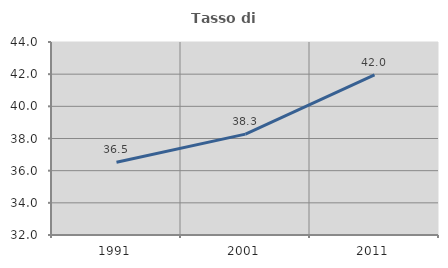
| Category | Tasso di occupazione   |
|---|---|
| 1991.0 | 36.525 |
| 2001.0 | 38.273 |
| 2011.0 | 41.952 |